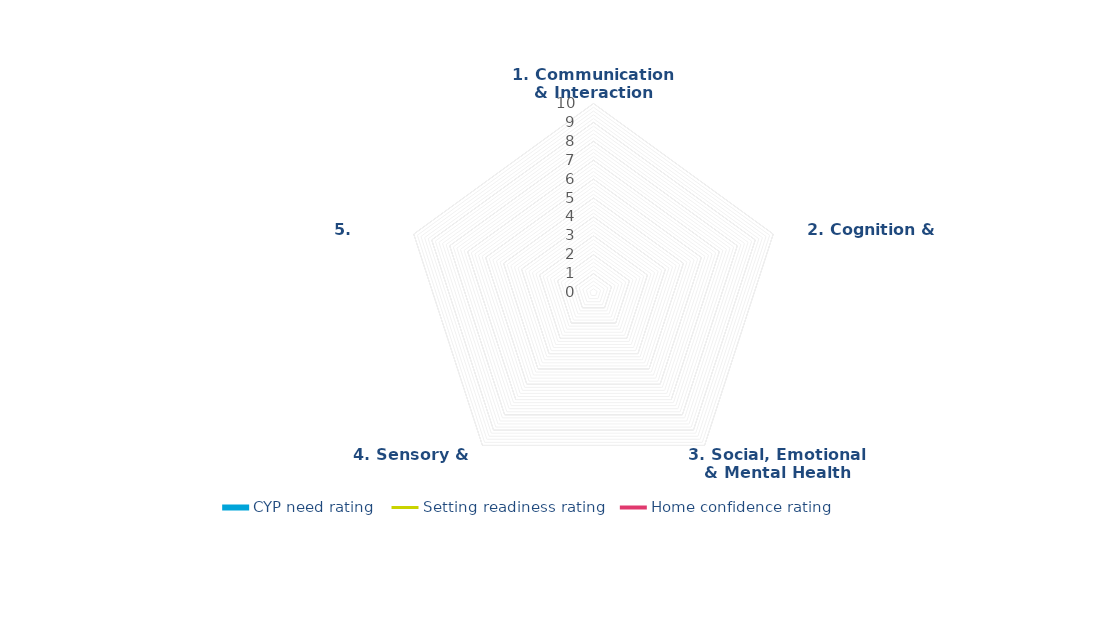
| Category | CYP need rating | Setting readiness rating | Home confidence rating |
|---|---|---|---|
| 1. Communication & Interaction | 0 | 0 | 0 |
| 2. Cognition & Learning | 0 | 0 | 0 |
| 3. Social, Emotional & Mental Health | 0 | 0 | 0 |
| 4. Sensory & Physical | 0 | 0 | 0 |
| 5. Independence | 0 | 0 | 0 |